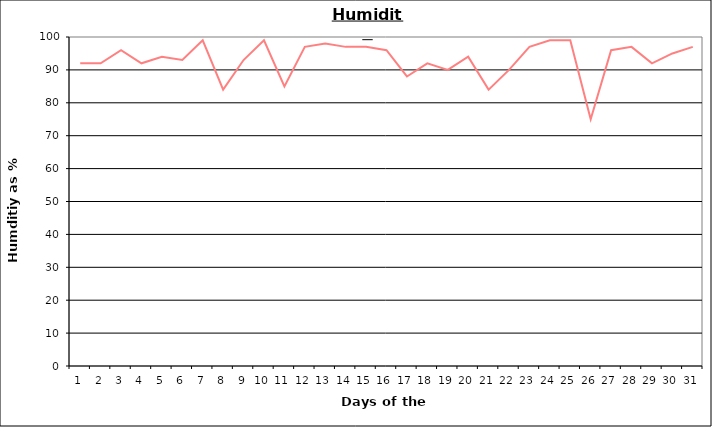
| Category | Series 0 |
|---|---|
| 0 | 92 |
| 1 | 92 |
| 2 | 96 |
| 3 | 92 |
| 4 | 94 |
| 5 | 93 |
| 6 | 99 |
| 7 | 84 |
| 8 | 93 |
| 9 | 99 |
| 10 | 85 |
| 11 | 97 |
| 12 | 98 |
| 13 | 97 |
| 14 | 97 |
| 15 | 96 |
| 16 | 88 |
| 17 | 92 |
| 18 | 90 |
| 19 | 94 |
| 20 | 84 |
| 21 | 90 |
| 22 | 97 |
| 23 | 99 |
| 24 | 99 |
| 25 | 75 |
| 26 | 96 |
| 27 | 97 |
| 28 | 92 |
| 29 | 95 |
| 30 | 97 |